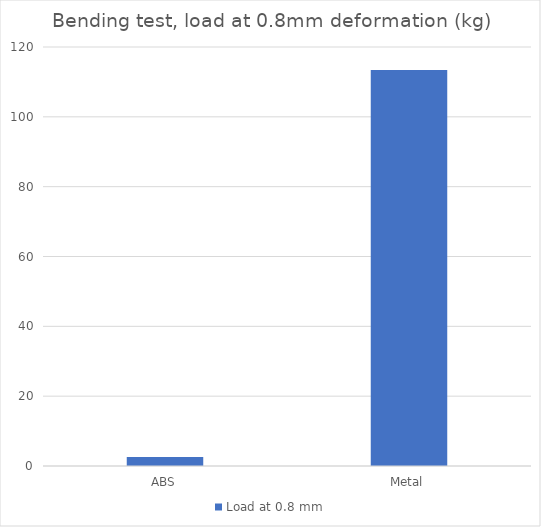
| Category | Load at 0.8 mm |
|---|---|
| ABS | 2.6 |
| Metal | 113.4 |